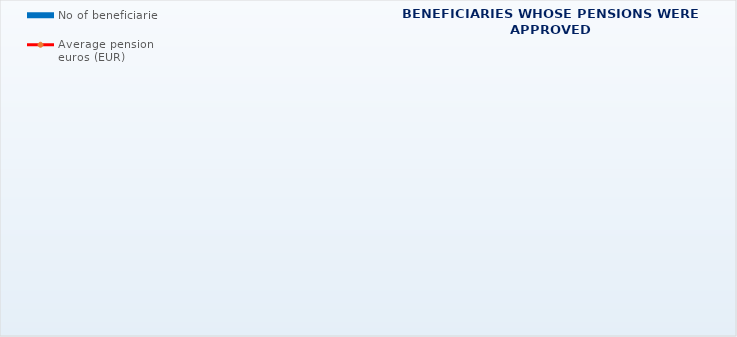
| Category | No of beneficiaries |
|---|---|
| Authorised officials in internal affairs, judicial officers and workers engaged in demining work: | 17264 |
| Pension beneficiaries entitled under the Fire Services Act (Official Gazette 125/19) | 347 |
| Active military personnel - DVO  | 16032 |
| Croatian Homeland Army veterans mobilised from 1941 to 1945 | 1935 |
| Former political prisoners | 2084 |
| Croatian Veterans from the Homeland War - ZOHBDR (Act on Croatian Homeland War Veterans and Their Family Members) | 71255 |
| Pensions approved under general regulations and determined according to the Act on the Rights of Croatian Homeland War Veterans and their Family Members (ZOHBDR), in 2017 (Art. 27, 35, 48 and 49, paragraph 2)    | 57124 |
| Former Yugoslav People's Army members - JNA   | 3691 |
| Former Yugoslav People's Army members - JNA - Art. 185 of Pension Insurance Act (ZOMO)  | 158 |
| National Liberation War veterans - NOR | 5032 |
| Members of the Croatian Parliament, members of the Government, judges of the Constitutional Court and the Auditor General | 681 |
| Members of the Parliamentary Executive Council and administratively retired federal civil servants  (relates to the former SFRY) | 67 |
| Former officials of federal bodies o the former SFRJ -  Article 38 of the Pension Insurance Act (ZOMO) | 18 |
| Full members of the Croatian Academy of Sciences and Arts - HAZU | 127 |
| Miners from the Istrian coal mines "Tupljak" d.d. Labin  | 245 |
| Workers professionally exposed to asbestos | 820 |
| Insurees - crew members on a ship in international and national navigation  - Article  129, paragraph 2 of the Maritime Code | 203 |
| Members of the Croatian Defence Council - HVO  | 6727 |